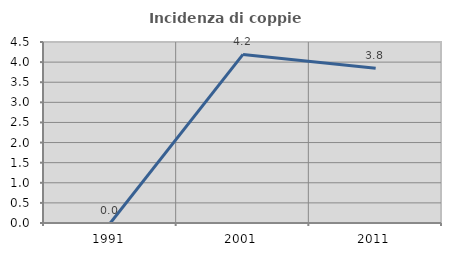
| Category | Incidenza di coppie miste |
|---|---|
| 1991.0 | 0 |
| 2001.0 | 4.192 |
| 2011.0 | 3.846 |